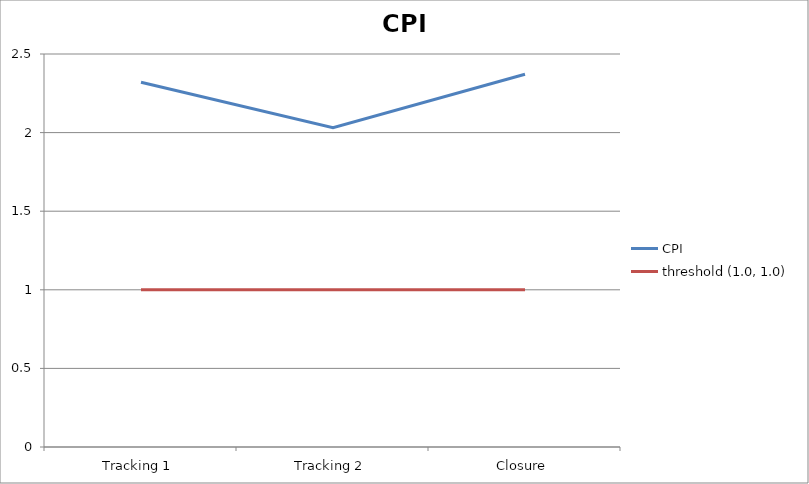
| Category | CPI | threshold (1.0, 1.0) |
|---|---|---|
| Tracking 1 | 2.32 | 1 |
| Tracking 2 | 2.031 | 1 |
| Closure | 2.371 | 1 |